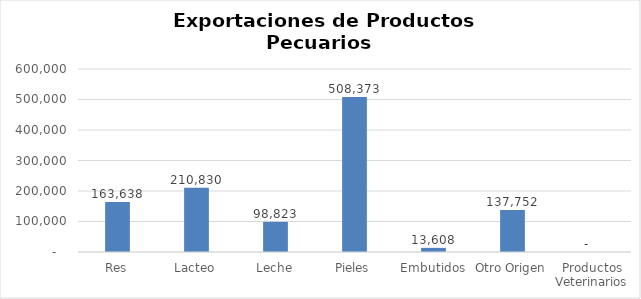
| Category | Kilos |
|---|---|
| Res | 163637.97 |
| Lacteo | 210829.98 |
| Leche | 98823.13 |
| Pieles | 508372.9 |
| Embutidos | 13607.78 |
| Otro Origen | 137752.08 |
| Productos Veterinarios | 0 |